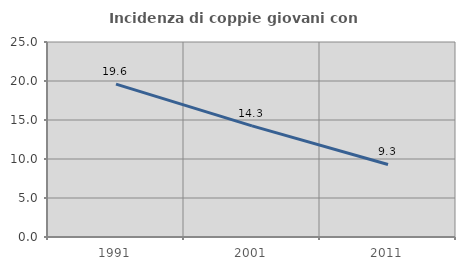
| Category | Incidenza di coppie giovani con figli |
|---|---|
| 1991.0 | 19.6 |
| 2001.0 | 14.25 |
| 2011.0 | 9.296 |